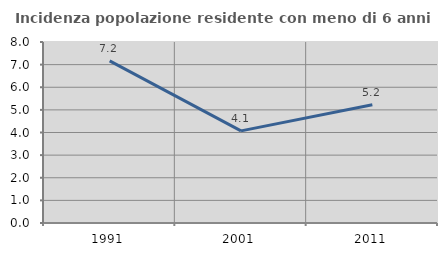
| Category | Incidenza popolazione residente con meno di 6 anni |
|---|---|
| 1991.0 | 7.164 |
| 2001.0 | 4.072 |
| 2011.0 | 5.23 |